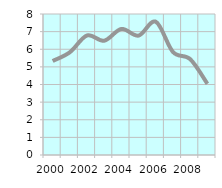
| Category | Average Employees
 per establishment |
|---|---|
| 2000.0 | 5.333 |
| 2001.0 | 5.828 |
| 2002.0 | 6.781 |
| 2003.0 | 6.484 |
| 2004.0 | 7.152 |
| 2005.0 | 6.774 |
| 2006.0 | 7.562 |
| 2007.0 | 5.844 |
| 2008.0 | 5.438 |
| 2009.0 | 4.04 |